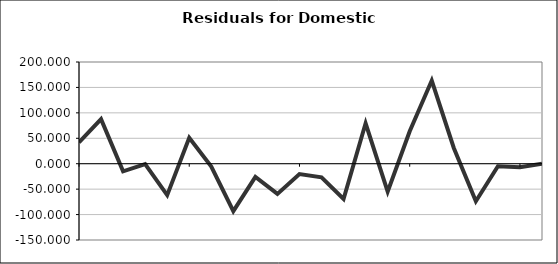
| Category | Series 0 |
|---|---|
| 0 | 41.83 |
| 1 | 87.643 |
| 2 | -15.012 |
| 3 | -0.903 |
| 4 | -61.707 |
| 5 | 50.782 |
| 6 | -5.665 |
| 7 | -93.334 |
| 8 | -25.786 |
| 9 | -59.288 |
| 10 | -20.229 |
| 11 | -26.693 |
| 12 | -69.414 |
| 13 | 79.439 |
| 14 | -54.877 |
| 15 | 63.933 |
| 16 | 163.612 |
| 17 | 31.004 |
| 18 | -73.765 |
| 19 | -4.836 |
| 20 | -6.735 |
| 21 | 0 |